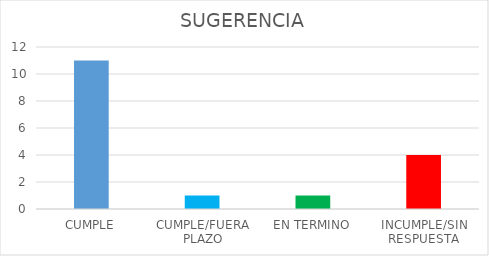
| Category | TOTAL |
|---|---|
| CUMPLE | 11 |
| CUMPLE/FUERA PLAZO | 1 |
| EN TERMINO | 1 |
| INCUMPLE/SIN RESPUESTA | 4 |